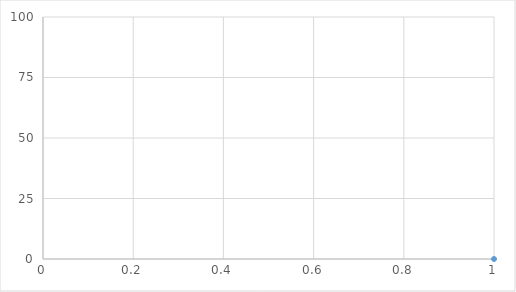
| Category | Series 0 |
|---|---|
| 0 | 0 |
| 1 | 7.241 |
| 2 | 18.919 |
| 3 | 44.94 |
| 4 | 52.156 |
| 5 | 58.693 |
| 6 | 60.043 |
| 7 | 73.074 |
| 8 | 100 |
| 9 | 100 |